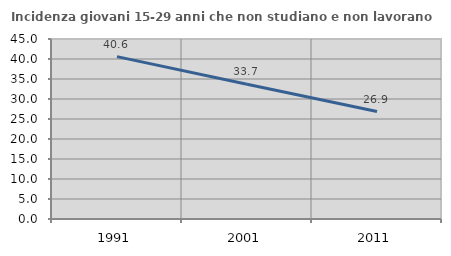
| Category | Incidenza giovani 15-29 anni che non studiano e non lavorano  |
|---|---|
| 1991.0 | 40.588 |
| 2001.0 | 33.699 |
| 2011.0 | 26.852 |